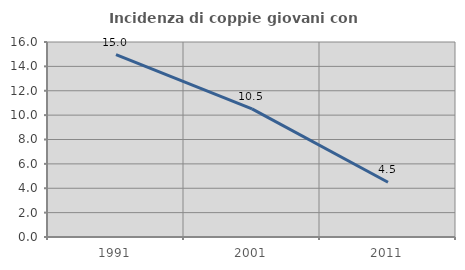
| Category | Incidenza di coppie giovani con figli |
|---|---|
| 1991.0 | 14.968 |
| 2001.0 | 10.507 |
| 2011.0 | 4.49 |